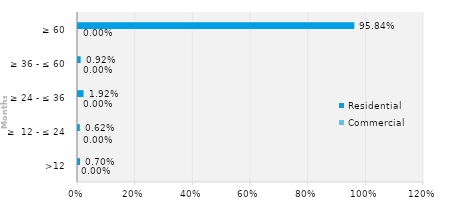
| Category | Commercial | Residential |
|---|---|---|
| >12 | 0 | 0.007 |
| ≥  12 - ≤ 24 | 0 | 0.006 |
| ≥ 24 - ≤ 36 | 0 | 0.019 |
| ≥ 36 - ≤ 60 | 0 | 0.009 |
| ≥ 60 | 0 | 0.958 |